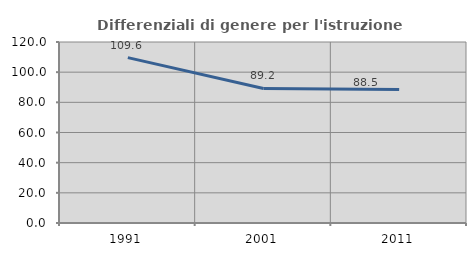
| Category | Differenziali di genere per l'istruzione superiore |
|---|---|
| 1991.0 | 109.622 |
| 2001.0 | 89.204 |
| 2011.0 | 88.525 |